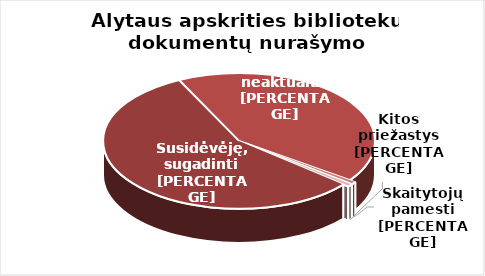
| Category | Series 0 |
|---|---|
| 0 | 34167 |
| 1 | 25391 |
| 2 | 385 |
| 3 | 402 |